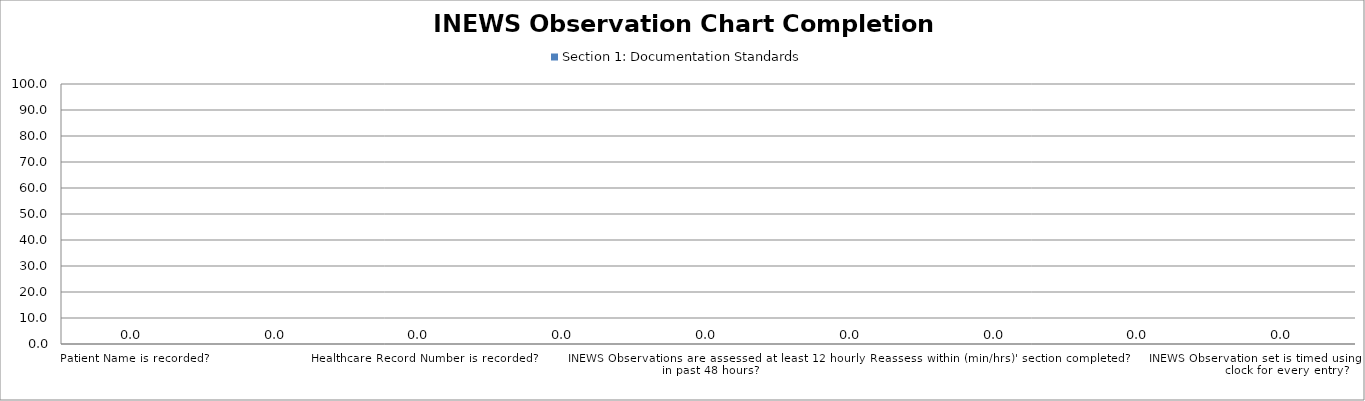
| Category | Section 1: Documentation Standards |
|---|---|
| Patient Name is recorded? | 0 |
| Date of Birth Recorded? | 0 |
| Healthcare Record Number is recorded? | 0 |
| INEWS Observations completed 6 hourly for first 24 hours following admission?
 (if admitted during audit timeframe) | 0 |
| INEWS Observations are assessed at least 12 hourly in past 48 hours? | 0 |
| Frequency of monitoring increased as patient’s clinical condition required? | 0 |
| Reassess within (min/hrs)' section completed? | 0 |
| INEWS observation set is dated for every entry? | 0 |
| INEWS Observation set is timed using the 24-hour clock for every entry? | 0 |